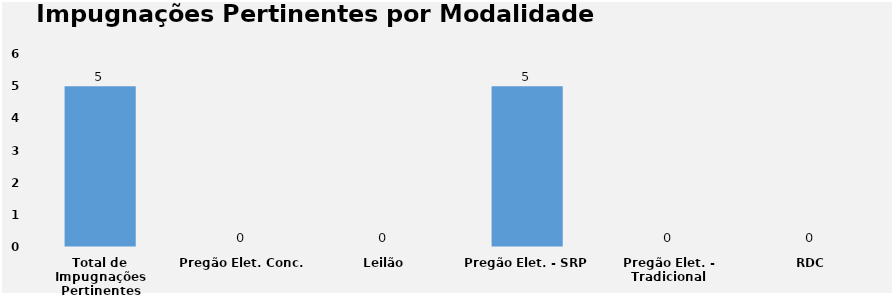
| Category | Series 0 |
|---|---|
| Total de Impugnações Pertinentes | 5 |
| Pregão Elet. Conc. | 0 |
| Leilão | 0 |
| Pregão Elet. - SRP | 5 |
| Pregão Elet. - Tradicional | 0 |
| RDC | 0 |